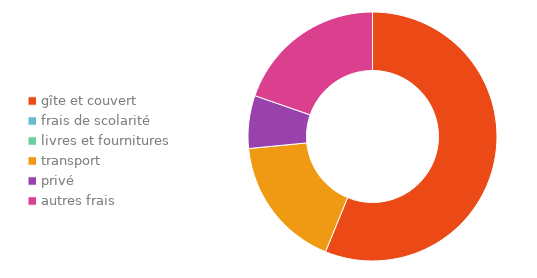
| Category | Series 0 |
|---|---|
| gîte et couvert | 0.253 |
| frais de scolarité | 0.336 |
| livres et fournitures | 0.146 |
| transport | 0.078 |
| privé | 0.076 |
| autres frais | 0.112 |